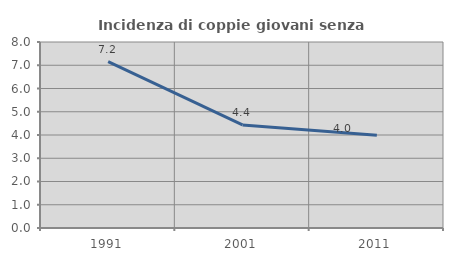
| Category | Incidenza di coppie giovani senza figli |
|---|---|
| 1991.0 | 7.159 |
| 2001.0 | 4.432 |
| 2011.0 | 3.993 |